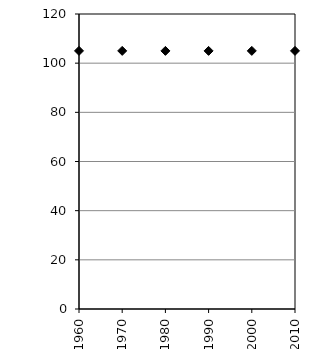
| Category | Series 0 |
|---|---|
| 1960.0 | 105 |
| 1970.0 | 105 |
| 1980.0 | 105 |
| 1990.0 | 105 |
| 2000.0 | 105 |
| 2010.0 | 105 |